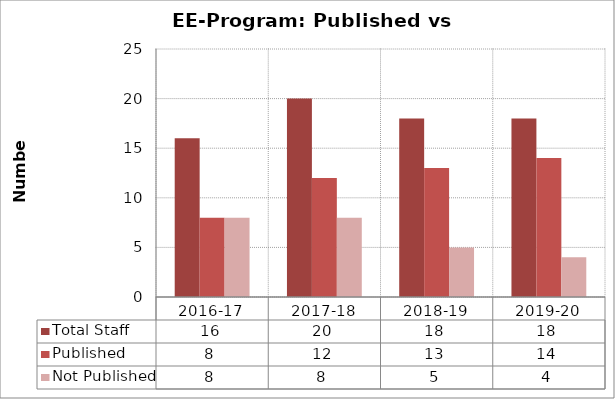
| Category | Total Staff | Published | Not Published |
|---|---|---|---|
| 2016-17 | 16 | 8 | 8 |
| 2017-18 | 20 | 12 | 8 |
| 2018-19 | 18 | 13 | 5 |
| 2019-20 | 18 | 14 | 4 |